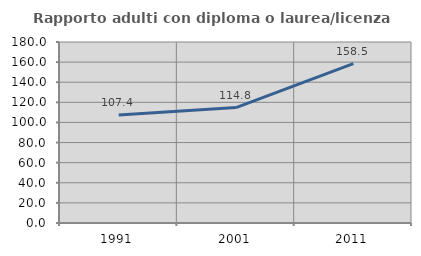
| Category | Rapporto adulti con diploma o laurea/licenza media  |
|---|---|
| 1991.0 | 107.447 |
| 2001.0 | 114.765 |
| 2011.0 | 158.451 |